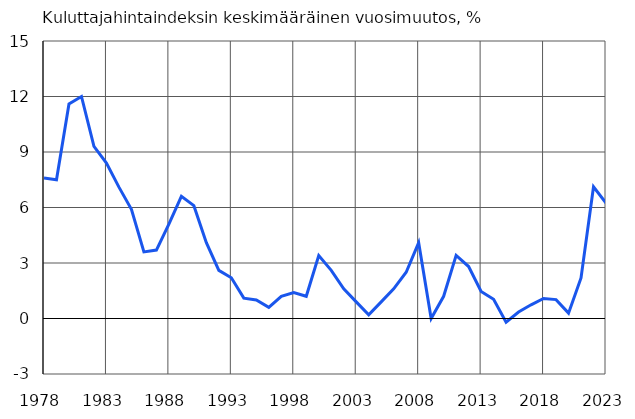
| Category | Kuluttajahintaindeksin keskimääräinen vuosimuutos, % |
|---|---|
| 1978.0 | 7.6 |
| 1979.0 | 7.5 |
| 1980.0 | 11.6 |
| 1981.0 | 12 |
| 1982.0 | 9.3 |
| 1983.0 | 8.4 |
| 1984.0 | 7.1 |
| 1985.0 | 5.9 |
| 1986.0 | 3.6 |
| 1987.0 | 3.7 |
| 1988.0 | 5.1 |
| 1989.0 | 6.6 |
| 1990.0 | 6.1 |
| 1991.0 | 4.1 |
| 1992.0 | 2.6 |
| 1993.0 | 2.2 |
| 1994.0 | 1.1 |
| 1995.0 | 1 |
| 1996.0 | 0.6 |
| 1997.0 | 1.2 |
| 1998.0 | 1.4 |
| 1999.0 | 1.2 |
| 2000.0 | 3.4 |
| 2001.0 | 2.6 |
| 2002.0 | 1.6 |
| 2003.0 | 0.9 |
| 2004.0 | 0.2 |
| 2005.0 | 0.9 |
| 2006.0 | 1.6 |
| 2007.0 | 2.5 |
| 2008.0 | 4.1 |
| 2009.0 | 0 |
| 2010.0 | 1.2 |
| 2011.0 | 3.41 |
| 2012.0 | 2.81 |
| 2013.0 | 1.46 |
| 2014.0 | 1.04 |
| 2015.0 | -0.2 |
| 2016.0 | 0.35 |
| 2017.0 | 0.74 |
| 2018.0 | 1.08 |
| 2019.0 | 1.02 |
| 2020.0 | 0.29 |
| 2021.0 | 2.19 |
| 2022.0 | 7.12 |
| 2023.0 | 6.24 |